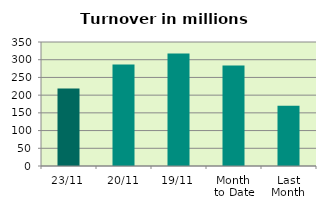
| Category | Series 0 |
|---|---|
| 23/11 | 218.977 |
| 20/11 | 286.292 |
| 19/11 | 317.422 |
| Month 
to Date | 283.592 |
| Last
Month | 170.355 |